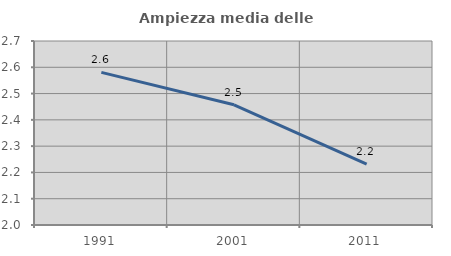
| Category | Ampiezza media delle famiglie |
|---|---|
| 1991.0 | 2.581 |
| 2001.0 | 2.457 |
| 2011.0 | 2.231 |